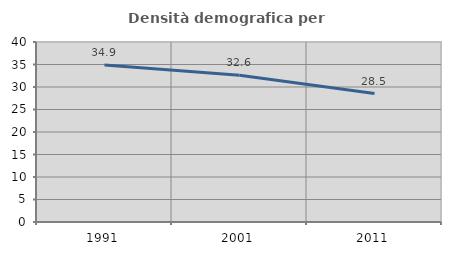
| Category | Densità demografica |
|---|---|
| 1991.0 | 34.899 |
| 2001.0 | 32.635 |
| 2011.0 | 28.535 |